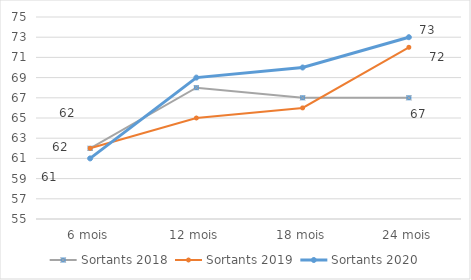
| Category | Sortants 2018 | Sortants 2019 | Sortants 2020 |
|---|---|---|---|
| 6 mois | 62 | 62 | 61 |
| 12 mois | 68 | 65 | 69 |
| 18 mois | 67 | 66 | 70 |
| 24 mois | 67 | 72 | 73 |